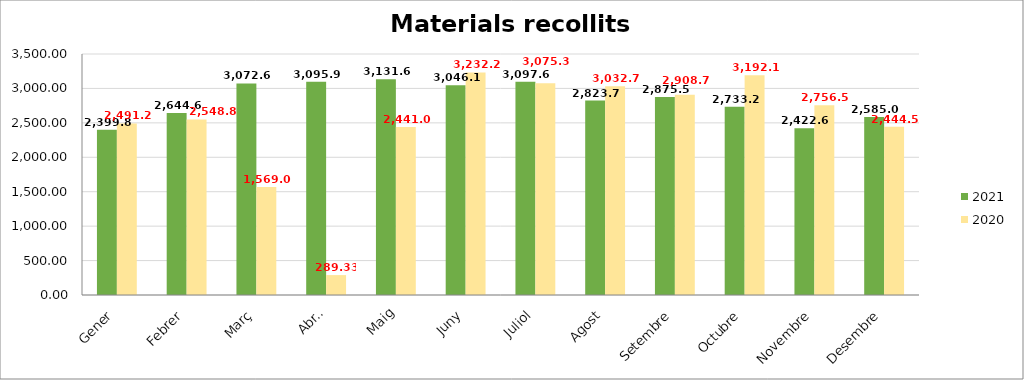
| Category | 2021 | 2020 |
|---|---|---|
| Gener | 2399.883 | 2491.249 |
| Febrer | 2644.682 | 2548.797 |
| Març | 3072.66 | 1569.068 |
| Abril | 3095.99 | 289.327 |
| Maig | 3131.673 | 2441.04 |
| Juny | 3046.175 | 3232.237 |
| Juliol | 3097.668 | 3075.339 |
| Agost | 2823.783 | 3032.702 |
| Setembre | 2875.583 | 2908.7 |
| Octubre | 2733.205 | 3192.151 |
| Novembre | 2422.617 | 2756.506 |
| Desembre | 2585.032 | 2444.553 |